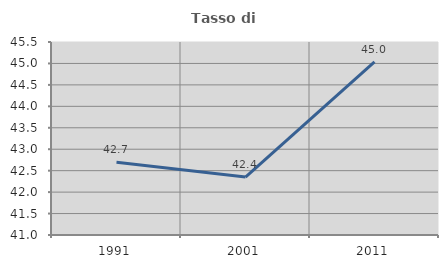
| Category | Tasso di occupazione   |
|---|---|
| 1991.0 | 42.697 |
| 2001.0 | 42.352 |
| 2011.0 | 45.037 |